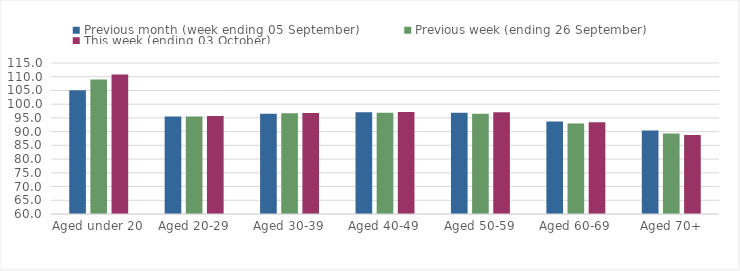
| Category | Previous month (week ending 05 September) | Previous week (ending 26 September) | This week (ending 03 October) |
|---|---|---|---|
| Aged under 20 | 105.06 | 109.03 | 110.79 |
| Aged 20-29 | 95.48 | 95.55 | 95.69 |
| Aged 30-39 | 96.56 | 96.68 | 96.76 |
| Aged 40-49 | 97.06 | 96.84 | 97.12 |
| Aged 50-59 | 96.92 | 96.55 | 97.05 |
| Aged 60-69 | 93.72 | 92.99 | 93.39 |
| Aged 70+ | 90.41 | 89.32 | 88.76 |